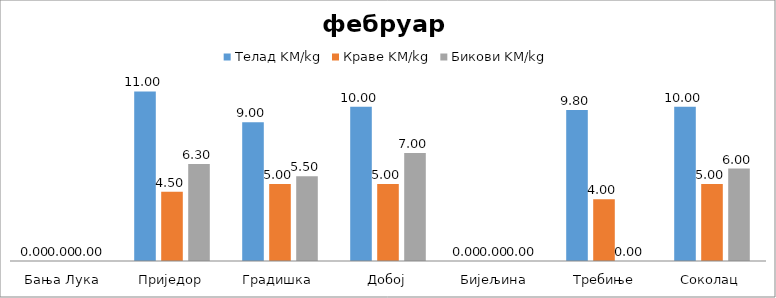
| Category | Телад | Краве | Бикови |
|---|---|---|---|
| Бања Лука | 0 | 0 | 0 |
| Приједор | 11 | 4.5 | 6.3 |
| Градишка | 9 | 5 | 5.5 |
| Добој | 10 | 5 | 7 |
| Бијељина | 0 | 0 | 0 |
|  Требиње | 9.8 | 4 | 0 |
| Соколац | 10 | 5 | 6 |